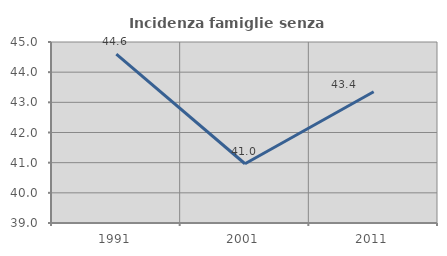
| Category | Incidenza famiglie senza nuclei |
|---|---|
| 1991.0 | 44.595 |
| 2001.0 | 40.964 |
| 2011.0 | 43.353 |